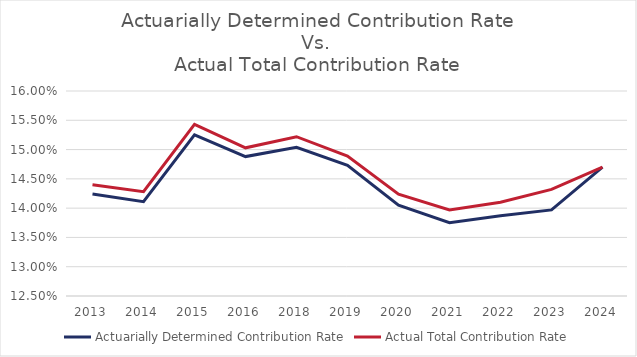
| Category | Actuarially Determined Contribution Rate | Actual Total Contribution Rate |
|---|---|---|
| 2013.0 | 0.142 | 0.144 |
| 2014.0 | 0.141 | 0.143 |
| 2015.0 | 0.152 | 0.154 |
| 2016.0 | 0.149 | 0.15 |
| 2018.0 | 0.15 | 0.152 |
| 2019.0 | 0.147 | 0.149 |
| 2020.0 | 0.14 | 0.142 |
| 2021.0 | 0.138 | 0.14 |
| 2022.0 | 0.139 | 0.141 |
| 2023.0 | 0.14 | 0.143 |
| 2024.0 | 0.147 | 0.147 |